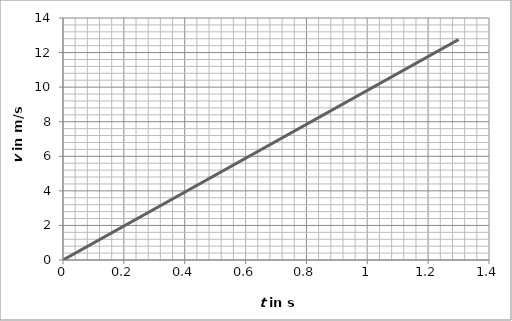
| Category | Series 0 |
|---|---|
| 0.0 | 0 |
| 0.02 | 0.196 |
| 0.04 | 0.392 |
| 0.06 | 0.589 |
| 0.08 | 0.785 |
| 0.1 | 0.981 |
| 0.12000000000000001 | 1.177 |
| 0.14 | 1.373 |
| 0.16 | 1.57 |
| 0.18 | 1.766 |
| 0.19999999999999998 | 1.962 |
| 0.21999999999999997 | 2.158 |
| 0.23999999999999996 | 2.354 |
| 0.25999999999999995 | 2.551 |
| 0.27999999999999997 | 2.747 |
| 0.3 | 2.943 |
| 0.32 | 3.139 |
| 0.34 | 3.335 |
| 0.36000000000000004 | 3.532 |
| 0.38000000000000006 | 3.728 |
| 0.4000000000000001 | 3.924 |
| 0.4200000000000001 | 4.12 |
| 0.4400000000000001 | 4.316 |
| 0.46000000000000013 | 4.513 |
| 0.48000000000000015 | 4.709 |
| 0.5000000000000001 | 4.905 |
| 0.5200000000000001 | 5.101 |
| 0.5400000000000001 | 5.297 |
| 0.5600000000000002 | 5.494 |
| 0.5800000000000002 | 5.69 |
| 0.6000000000000002 | 5.886 |
| 0.6200000000000002 | 6.082 |
| 0.6400000000000002 | 6.278 |
| 0.6600000000000003 | 6.475 |
| 0.6800000000000003 | 6.671 |
| 0.7000000000000003 | 6.867 |
| 0.7200000000000003 | 7.063 |
| 0.7400000000000003 | 7.259 |
| 0.7600000000000003 | 7.456 |
| 0.7800000000000004 | 7.652 |
| 0.8000000000000004 | 7.848 |
| 0.8200000000000004 | 8.044 |
| 0.8400000000000004 | 8.24 |
| 0.8600000000000004 | 8.437 |
| 0.8800000000000004 | 8.633 |
| 0.9000000000000005 | 8.829 |
| 0.9200000000000005 | 9.025 |
| 0.9400000000000005 | 9.221 |
| 0.9600000000000005 | 9.418 |
| 0.9800000000000005 | 9.614 |
| 1.0000000000000004 | 9.81 |
| 1.0200000000000005 | 10.006 |
| 1.0400000000000005 | 10.202 |
| 1.0600000000000005 | 10.399 |
| 1.0800000000000005 | 10.595 |
| 1.1000000000000005 | 10.791 |
| 1.1200000000000006 | 10.987 |
| 1.1400000000000006 | 11.183 |
| 1.1600000000000006 | 11.38 |
| 1.1800000000000006 | 11.576 |
| 1.2000000000000006 | 11.772 |
| 1.2200000000000006 | 11.968 |
| 1.2400000000000007 | 12.164 |
| 1.2600000000000007 | 12.361 |
| 1.2800000000000007 | 12.557 |
| 1.3000000000000007 | 12.753 |